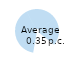
| Category | Share of deposits (Per cent) |
|---|---|
| Ordinary deposits with zero interest rate | 39.543 |
| Ordinary deposits with positive interest rate | 22.914 |
| Time deposits | 11.684 |
| Credit-related deposits | 8.869 |
| Pooling schemes | 16.991 |